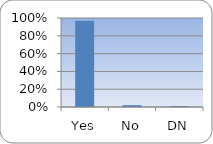
| Category | Series 0 |
|---|---|
| Yes | 0.969 |
| No | 0.021 |
| DN | 0.01 |